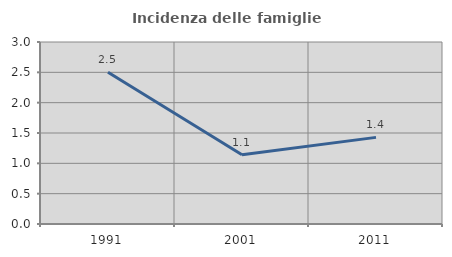
| Category | Incidenza delle famiglie numerose |
|---|---|
| 1991.0 | 2.5 |
| 2001.0 | 1.141 |
| 2011.0 | 1.428 |